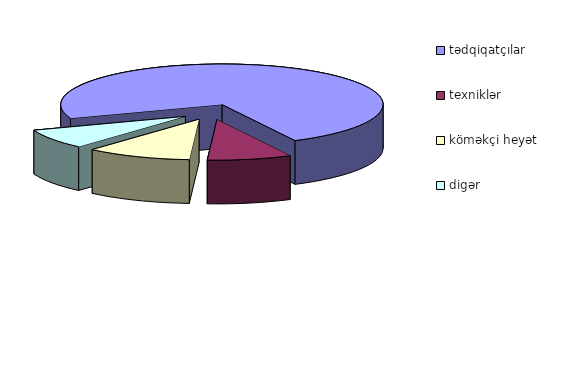
| Category | Series 0 |
|---|---|
| tədqiqatçılar | 14520 |
| texniklər | 1681 |
| köməkçi heyət | 2100 |
| digər  | 1574 |